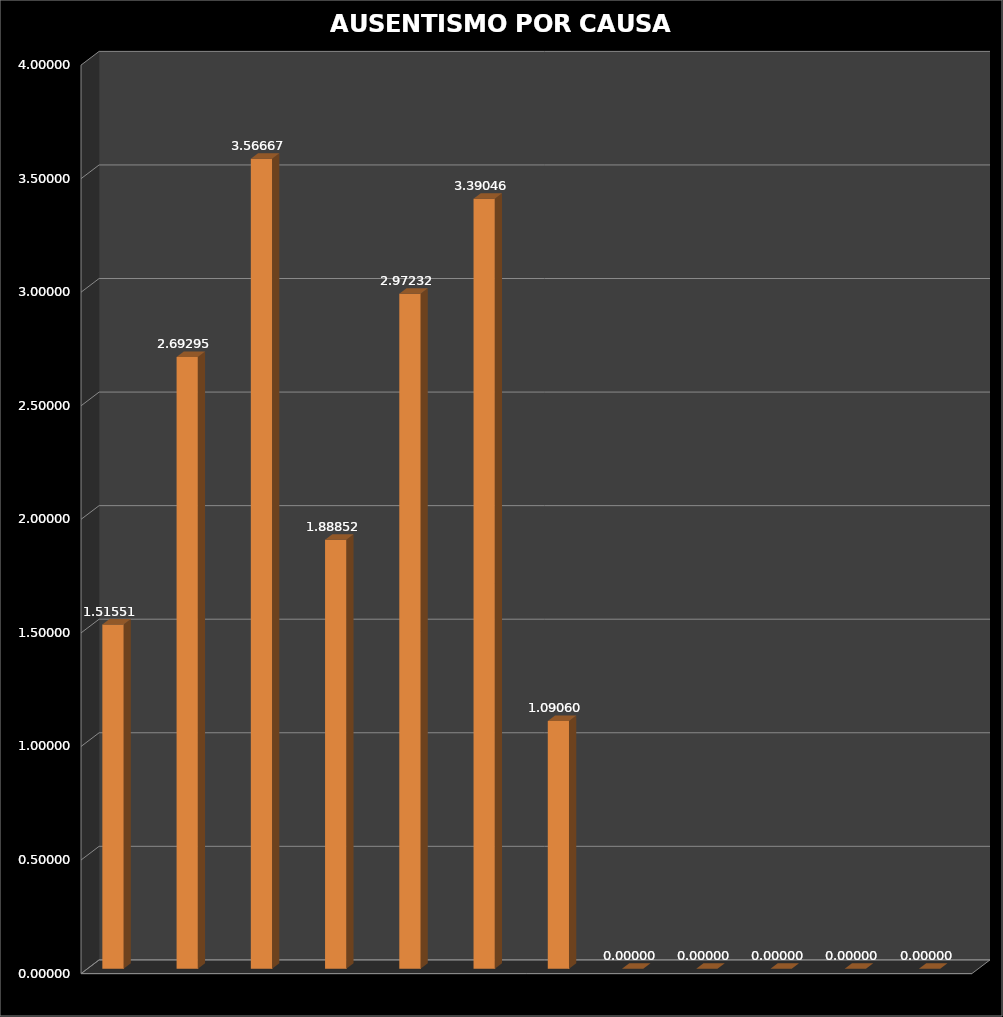
| Category | Series 0 | Series 1 |
|---|---|---|
| ENE | 1.516 |  |
| FEB | 2.693 |  |
| MAR | 3.567 |  |
| ABR | 1.889 |  |
| MAY | 2.972 |  |
| JUN | 3.39 |  |
| JUL | 1.091 |  |
| AGO | 0 |  |
| SEP | 0 |  |
| OCT | 0 |  |
| NOV | 0 |  |
| DIC | 0 |  |